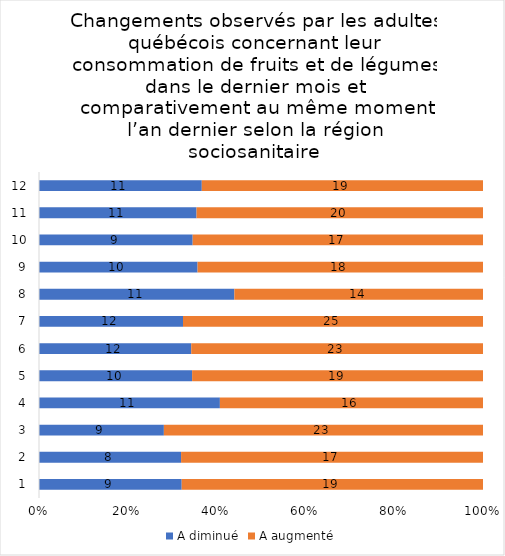
| Category | A diminué | A augmenté |
|---|---|---|
| 0 | 9 | 19 |
| 1 | 8 | 17 |
| 2 | 9 | 23 |
| 3 | 11 | 16 |
| 4 | 10 | 19 |
| 5 | 12 | 23 |
| 6 | 12 | 25 |
| 7 | 11 | 14 |
| 8 | 10 | 18 |
| 9 | 9 | 17 |
| 10 | 11 | 20 |
| 11 | 11 | 19 |